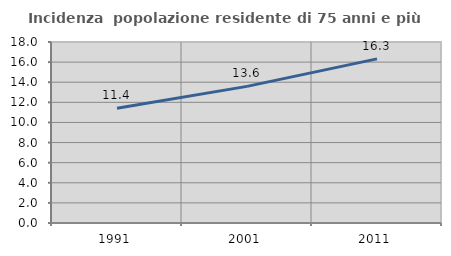
| Category | Incidenza  popolazione residente di 75 anni e più |
|---|---|
| 1991.0 | 11.402 |
| 2001.0 | 13.586 |
| 2011.0 | 16.321 |